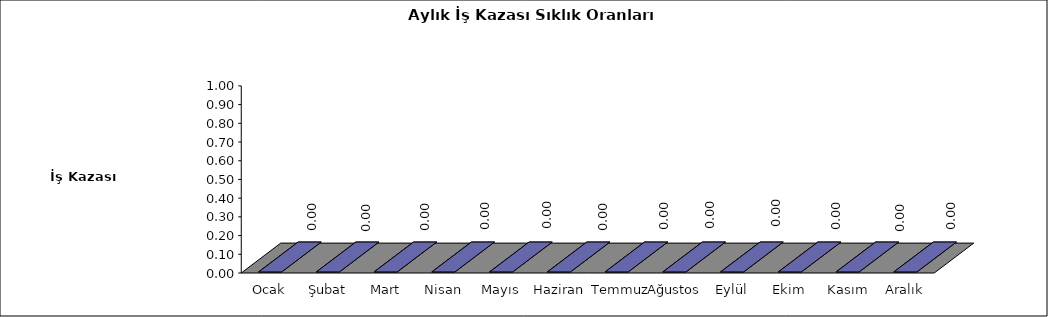
| Category | Series 0 |
|---|---|
| Ocak | 0 |
| Şubat | 0 |
| Mart | 0 |
| Nisan | 0 |
| Mayıs | 0 |
| Haziran | 0 |
| Temmuz | 0 |
| Ağustos | 0 |
| Eylül | 0 |
| Ekim | 0 |
| Kasım | 0 |
| Aralık | 0 |